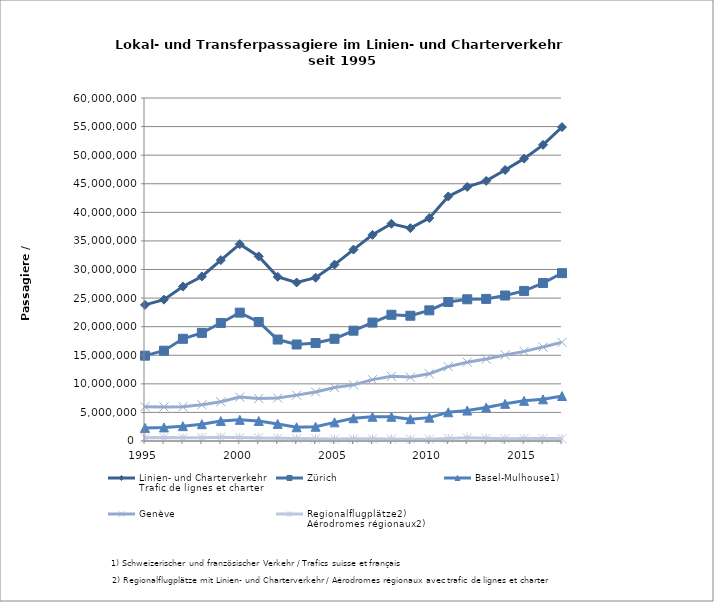
| Category | Linien- und Charterverkehr
Trafic de lignes et charter | Zürich | Basel-Mulhouse1) | Genève | Regionalflugplätze2)
Aérodromes régionaux2) |
|---|---|---|---|---|---|
| 1995 | 23807157 | 14926943 | 2294603 | 6009416 | 576195 |
| 1996 | 24731550 | 15797815 | 2374716 | 5955821 | 603198 |
| 1997 | 27017612 | 17875622 | 2596375 | 5989019 | 556596 |
| 1998 | 28781304 | 18907411 | 2937322 | 6346465 | 590106 |
| 1999 | 31645847 | 20649478 | 3490978 | 6859199 | 646192 |
| 2000 | 34426801 | 22450494 | 3699194 | 7677763 | 599350 |
| 2001 | 32291768 | 20818271 | 3497431 | 7430389 | 545677 |
| 2002 | 28717001 | 17747440 | 2980887 | 7509932 | 478742 |
| 2003 | 27723288 | 16882190 | 2403187 | 8022379 | 415532 |
| 2004 | 28570798 | 17133859 | 2487962 | 8564653 | 384324 |
| 2005 | 30860051 | 17877978 | 3261762 | 9360621 | 359690 |
| 2006 | 33487883 | 19298560 | 3984957 | 9816477 | 387889 |
| 2007 | 36067164 | 20717105 | 4236519 | 10734901 | 378639 |
| 2008 | 37995844 | 22075378 | 4234874 | 11316567 | 369025 |
| 2009 | 37235027 | 21914287 | 3818984 | 11175056 | 326700 |
| 2010 | 39009046 | 22854358 | 4087931 | 11748972 | 317785 |
| 2011 | 42773339 | 24313250 | 5020987 | 13003611 | 435491 |
| 2012 | 44444210 | 24789083 | 5322516 | 13785309 | 547302 |
| 2013 | 45501533 | 24853679 | 5843927 | 14328107 | 475820 |
| 2014 | 47406431 | 25451017 | 6498654 | 15057335 | 399425 |
| 2015 | 49392700 | 26251507 | 7028970 | 15682128 | 430095 |
| 2016 | 51800530 | 27630699 | 7287084 | 16444335 | 438412 |
| 2017 | 54911905 | 29361201 | 7868537 | 17259942 | 422225 |